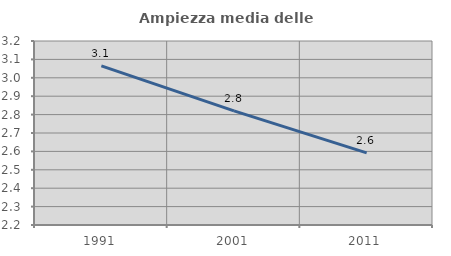
| Category | Ampiezza media delle famiglie |
|---|---|
| 1991.0 | 3.065 |
| 2001.0 | 2.82 |
| 2011.0 | 2.592 |